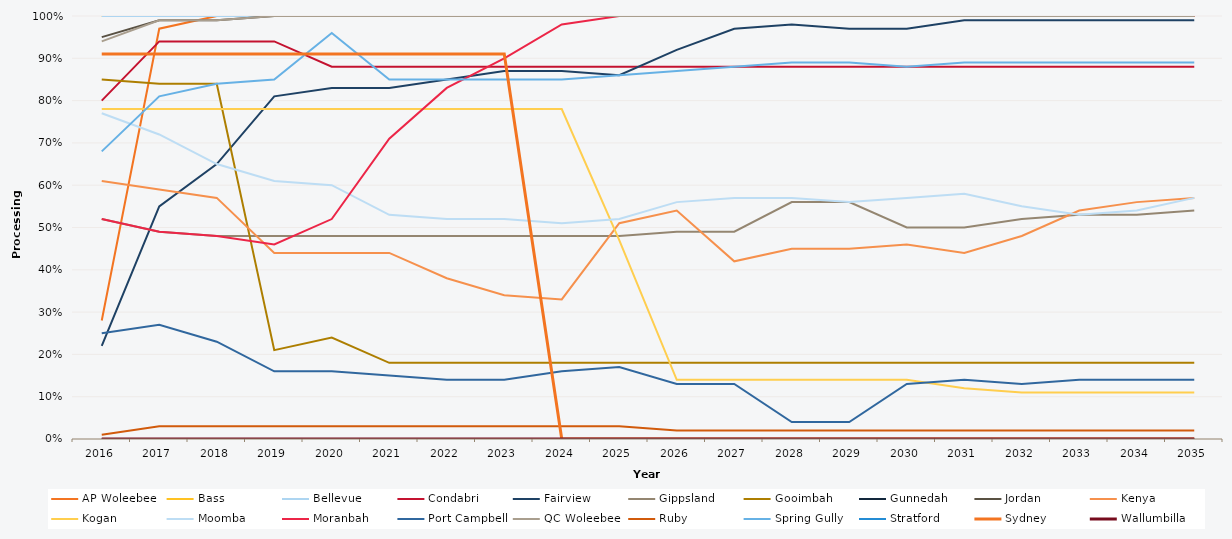
| Category | AP Woleebee | Bass | Bellevue | Condabri | Fairview | Gippsland | Gooimbah | Gunnedah | Jordan | Kenya | Kogan | Moomba | Moranbah | Port Campbell | QC Woleebee | Ruby | Spring Gully | Stratford | Sydney | Wallumbilla |
|---|---|---|---|---|---|---|---|---|---|---|---|---|---|---|---|---|---|---|---|---|
| 2016.0 | 0.28 | 1 | 1 | 0.8 | 0.22 | 0.52 | 0.85 | 0 | 0.95 | 0.61 | 0.78 | 0.77 | 0.52 | 0.25 | 0.94 | 0.01 | 0.68 | 0 | 0.91 | 0 |
| 2017.0 | 0.97 | 1 | 1 | 0.94 | 0.55 | 0.49 | 0.84 | 0 | 0.99 | 0.59 | 0.78 | 0.72 | 0.49 | 0.27 | 0.99 | 0.03 | 0.81 | 0 | 0.91 | 0 |
| 2018.0 | 1 | 1 | 1 | 0.94 | 0.65 | 0.48 | 0.84 | 0 | 0.99 | 0.57 | 0.78 | 0.65 | 0.48 | 0.23 | 0.99 | 0.03 | 0.84 | 0 | 0.91 | 0 |
| 2019.0 | 1 | 1 | 1 | 0.94 | 0.81 | 0.48 | 0.21 | 0 | 1 | 0.44 | 0.78 | 0.61 | 0.46 | 0.16 | 1 | 0.03 | 0.85 | 0 | 0.91 | 0 |
| 2020.0 | 1 | 1 | 1 | 0.88 | 0.83 | 0.48 | 0.24 | 0 | 1 | 0.44 | 0.78 | 0.6 | 0.52 | 0.16 | 1 | 0.03 | 0.96 | 0 | 0.91 | 0 |
| 2021.0 | 1 | 1 | 1 | 0.88 | 0.83 | 0.48 | 0.18 | 0 | 1 | 0.44 | 0.78 | 0.53 | 0.71 | 0.15 | 1 | 0.03 | 0.85 | 0 | 0.91 | 0 |
| 2022.0 | 1 | 1 | 1 | 0.88 | 0.85 | 0.48 | 0.18 | 0 | 1 | 0.38 | 0.78 | 0.52 | 0.83 | 0.14 | 1 | 0.03 | 0.85 | 0 | 0.91 | 0 |
| 2023.0 | 1 | 1 | 1 | 0.88 | 0.87 | 0.48 | 0.18 | 0 | 1 | 0.34 | 0.78 | 0.52 | 0.9 | 0.14 | 1 | 0.03 | 0.85 | 0 | 0.91 | 0 |
| 2024.0 | 1 | 1 | 1 | 0.88 | 0.87 | 0.48 | 0.18 | 0 | 1 | 0.33 | 0.78 | 0.51 | 0.98 | 0.16 | 1 | 0.03 | 0.85 | 0 | 0 | 0 |
| 2025.0 | 1 | 1 | 1 | 0.88 | 0.86 | 0.48 | 0.18 | 0 | 1 | 0.51 | 0.47 | 0.52 | 1 | 0.17 | 1 | 0.03 | 0.86 | 0 | 0 | 0 |
| 2026.0 | 1 | 1 | 1 | 0.88 | 0.92 | 0.49 | 0.18 | 0 | 1 | 0.54 | 0.14 | 0.56 | 1 | 0.13 | 1 | 0.02 | 0.87 | 0 | 0 | 0 |
| 2027.0 | 1 | 1 | 1 | 0.88 | 0.97 | 0.49 | 0.18 | 0 | 1 | 0.42 | 0.14 | 0.57 | 1 | 0.13 | 1 | 0.02 | 0.88 | 0 | 0 | 0 |
| 2028.0 | 1 | 1 | 1 | 0.88 | 0.98 | 0.56 | 0.18 | 0 | 1 | 0.45 | 0.14 | 0.57 | 1 | 0.04 | 1 | 0.02 | 0.89 | 0 | 0 | 0 |
| 2029.0 | 1 | 1 | 1 | 0.88 | 0.97 | 0.56 | 0.18 | 0 | 1 | 0.45 | 0.14 | 0.56 | 1 | 0.04 | 1 | 0.02 | 0.89 | 0 | 0 | 0 |
| 2030.0 | 1 | 1 | 1 | 0.88 | 0.97 | 0.5 | 0.18 | 0 | 1 | 0.46 | 0.14 | 0.57 | 1 | 0.13 | 1 | 0.02 | 0.88 | 0 | 0 | 0 |
| 2031.0 | 1 | 1 | 1 | 0.88 | 0.99 | 0.5 | 0.18 | 0 | 1 | 0.44 | 0.12 | 0.58 | 1 | 0.14 | 1 | 0.02 | 0.89 | 0 | 0 | 0 |
| 2032.0 | 1 | 1 | 1 | 0.88 | 0.99 | 0.52 | 0.18 | 0 | 1 | 0.48 | 0.11 | 0.55 | 1 | 0.13 | 1 | 0.02 | 0.89 | 0 | 0 | 0 |
| 2033.0 | 1 | 1 | 1 | 0.88 | 0.99 | 0.53 | 0.18 | 0 | 1 | 0.54 | 0.11 | 0.53 | 1 | 0.14 | 1 | 0.02 | 0.89 | 0 | 0 | 0 |
| 2034.0 | 1 | 1 | 1 | 0.88 | 0.99 | 0.53 | 0.18 | 0 | 1 | 0.56 | 0.11 | 0.54 | 1 | 0.14 | 1 | 0.02 | 0.89 | 0 | 0 | 0 |
| 2035.0 | 1 | 1 | 1 | 0.88 | 0.99 | 0.54 | 0.18 | 0 | 1 | 0.57 | 0.11 | 0.57 | 1 | 0.14 | 1 | 0.02 | 0.89 | 0 | 0 | 0 |